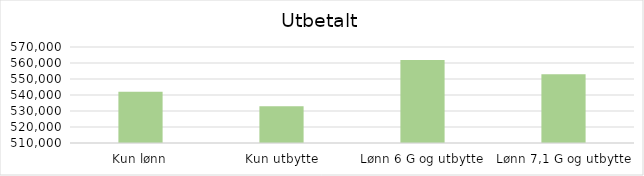
| Category | Series 0 |
|---|---|
| Kun lønn | 542064.674 |
| Kun utbytte | 532896 |
| Lønn 6 G og utbytte | 561946.897 |
| Lønn 7,1 G og utbytte | 552949.542 |